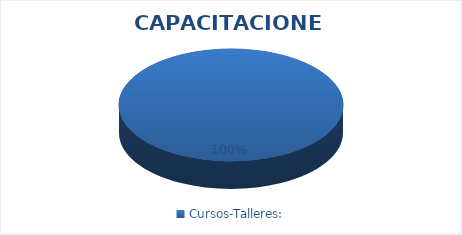
| Category | Series 0 |
|---|---|
| Cursos-Talleres: | 3 |